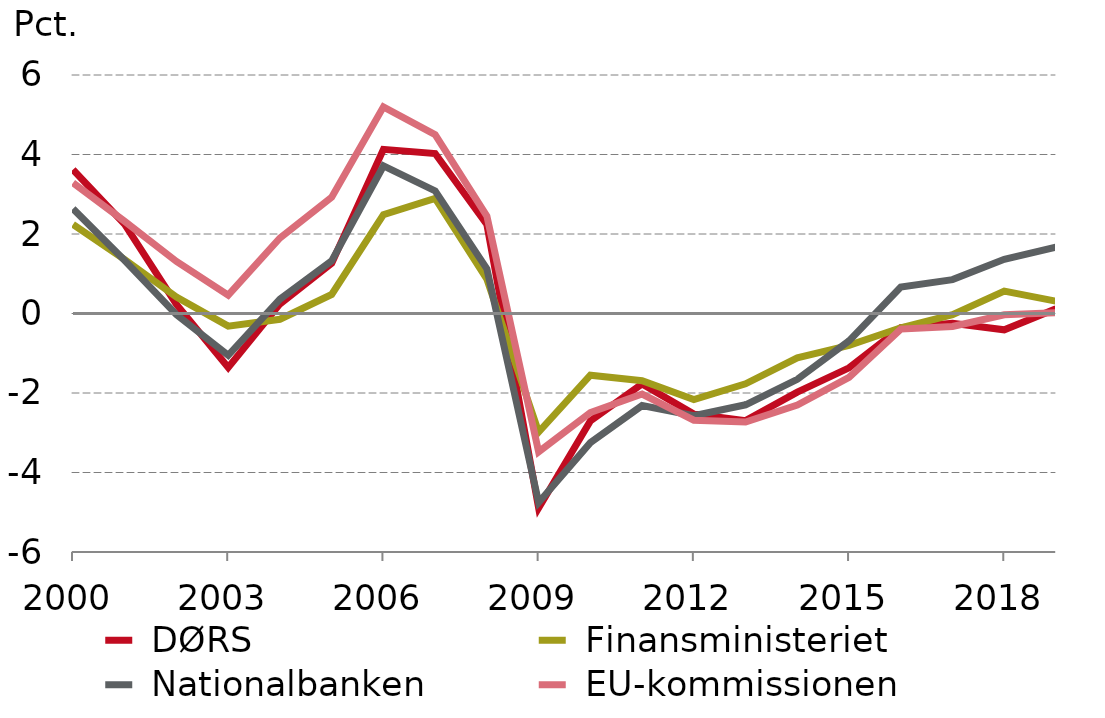
| Category |  DØRS |  Finansministeriet |  Nationalbanken |  EU-kommissionen | nullinje |
|---|---|---|---|---|---|
| 2000.0 | 3.618 | 2.241 | 2.636 | 3.286 | 0 |
| 2001.0 | 2.242 | 1.359 | 1.333 | 2.318 | 0 |
| 2002.0 | 0.227 | 0.416 | -0.031 | 1.309 | 0 |
| 2003.0 | -1.356 | -0.317 | -1.052 | 0.46 | 0 |
| 2004.0 | 0.242 | -0.145 | 0.359 | 1.9 | 0 |
| 2005.0 | 1.266 | 0.478 | 1.324 | 2.927 | 0 |
| 2006.0 | 4.13 | 2.487 | 3.712 | 5.198 | 0 |
| 2007.0 | 4.024 | 2.897 | 3.084 | 4.497 | 0 |
| 2008.0 | 2.237 | 0.863 | 1.122 | 2.45 | 0 |
| 2009.0 | -4.893 | -2.981 | -4.755 | -3.479 | 0 |
| 2010.0 | -2.704 | -1.554 | -3.249 | -2.491 | 0 |
| 2011.0 | -1.772 | -1.693 | -2.316 | -2.026 | 0 |
| 2012.0 | -2.529 | -2.164 | -2.569 | -2.685 | 0 |
| 2013.0 | -2.695 | -1.769 | -2.297 | -2.73 | 0 |
| 2014.0 | -1.978 | -1.115 | -1.657 | -2.303 | 0 |
| 2015.0 | -1.368 | -0.803 | -0.689 | -1.605 | 0 |
| 2016.0 | -0.354 | -0.36 | 0.663 | -0.392 | 0 |
| 2017.0 | -0.243 | -0.029 | 0.852 | -0.326 | 0 |
| 2018.0 | -0.411 | 0.561 | 1.365 | -0.031 | 0 |
| 2019.0 | 0.12 | 0.311 | 1.668 | 0.02 | 0 |